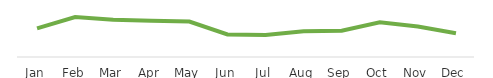
| Category | Cycle Time |
|---|---|
| Jan | 0.054 |
| Feb | 0.076 |
| Mar | 0.07 |
| Apr | 0.069 |
| May | 0.067 |
| Jun | 0.043 |
| Jul | 0.041 |
| Aug | 0.049 |
| Sep | 0.049 |
| Oct | 0.066 |
| Nov | 0.057 |
| Dec | 0.045 |